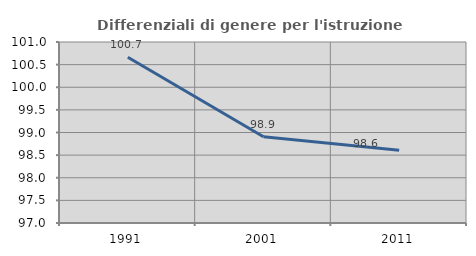
| Category | Differenziali di genere per l'istruzione superiore |
|---|---|
| 1991.0 | 100.664 |
| 2001.0 | 98.905 |
| 2011.0 | 98.61 |